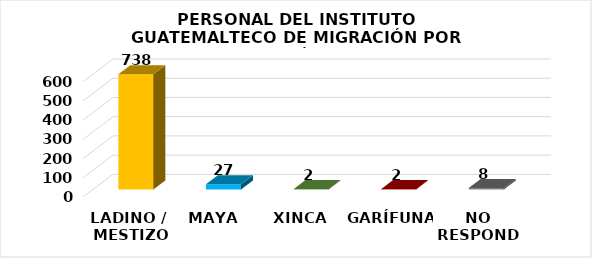
| Category | Series 0 |
|---|---|
| LADINO /
 MESTIZO | 738 |
| MAYA | 27 |
| XINCA | 2 |
| GARÍFUNA | 2 |
| NO RESPONDE | 8 |